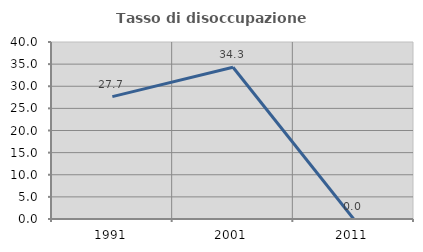
| Category | Tasso di disoccupazione giovanile  |
|---|---|
| 1991.0 | 27.66 |
| 2001.0 | 34.286 |
| 2011.0 | 0 |